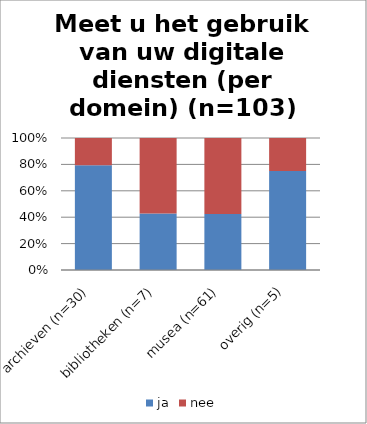
| Category | ja | nee |
|---|---|---|
| archieven (n=30) | 23 | 6 |
| bibliotheken (n=7) | 3 | 4 |
| musea (n=61) | 25 | 34 |
| overig (n=5) | 3 | 1 |